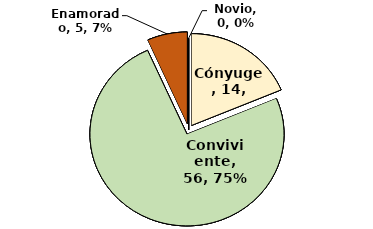
| Category | Series 0 |
|---|---|
| Cónyuge | 14 |
| Conviviente | 56 |
| Enamorado | 5 |
| Novio | 0 |